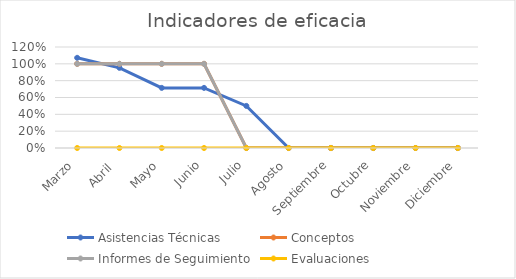
| Category | Asistencias Técnicas | Conceptos | Informes de Seguimiento | Evaluaciones |
|---|---|---|---|---|
| Marzo | 1.071 | 1 | 1 | 0 |
| Abril  | 0.952 | 1 | 1 | 0 |
| Mayo | 0.714 | 1 | 1 | 0 |
| Junio | 0.714 | 1 | 1 | 0 |
| Julio | 0.5 | 0 | 0 | 0 |
| Agosto | 0 | 0 | 0 | 0 |
| Septiembre | 0 | 0 | 0 | 0 |
| Octubre | 0 | 0 | 0 | 0 |
| Noviembre | 0 | 0 | 0 | 0 |
| Diciembre | 0 | 0 | 0 | 0 |